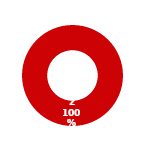
| Category | RM |
|---|---|
| MIL 1 Complete | 0 |
| MIL 1 Not Complete | 2 |